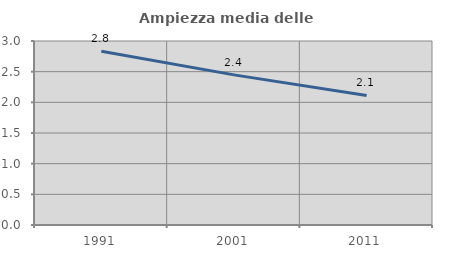
| Category | Ampiezza media delle famiglie |
|---|---|
| 1991.0 | 2.833 |
| 2001.0 | 2.448 |
| 2011.0 | 2.113 |